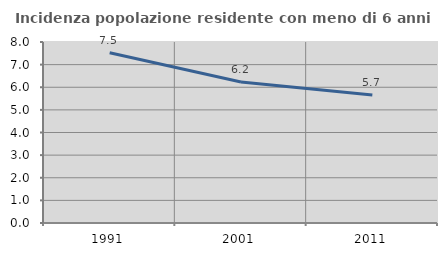
| Category | Incidenza popolazione residente con meno di 6 anni |
|---|---|
| 1991.0 | 7.527 |
| 2001.0 | 6.234 |
| 2011.0 | 5.659 |